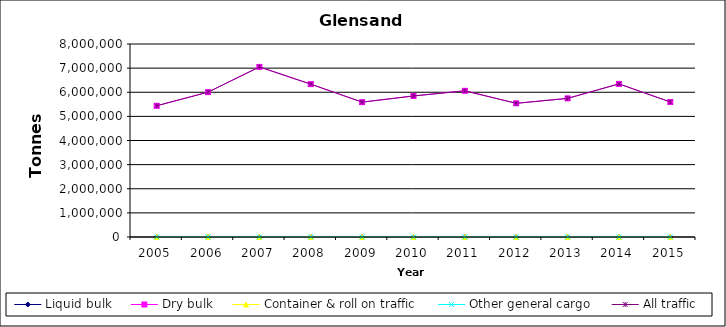
| Category | Liquid bulk | Dry bulk | Container & roll on traffic | Other general cargo | All traffic |
|---|---|---|---|---|---|
| 2005.0 | 0 | 5439000 | 0 | 0 | 5439000 |
| 2006.0 | 0 | 6004000 | 0 | 0 | 6004000 |
| 2007.0 | 0 | 7050000 | 0 | 0 | 7050000 |
| 2008.0 | 0 | 6336000 | 0 | 0 | 6336000 |
| 2009.0 | 0 | 5590653 | 0 | 0 | 5590653 |
| 2010.0 | 0 | 5846000 | 0 | 0 | 5846000 |
| 2011.0 | 0 | 6060000 | 0 | 0 | 6060000 |
| 2012.0 | 0 | 5541000 | 0 | 0 | 5541000 |
| 2013.0 | 0 | 5746000 | 0 | 0 | 5746000 |
| 2014.0 | 0 | 6347000 | 0 | 0 | 6347000 |
| 2015.0 | 0 | 5597000 | 0 | 0 | 5597000 |